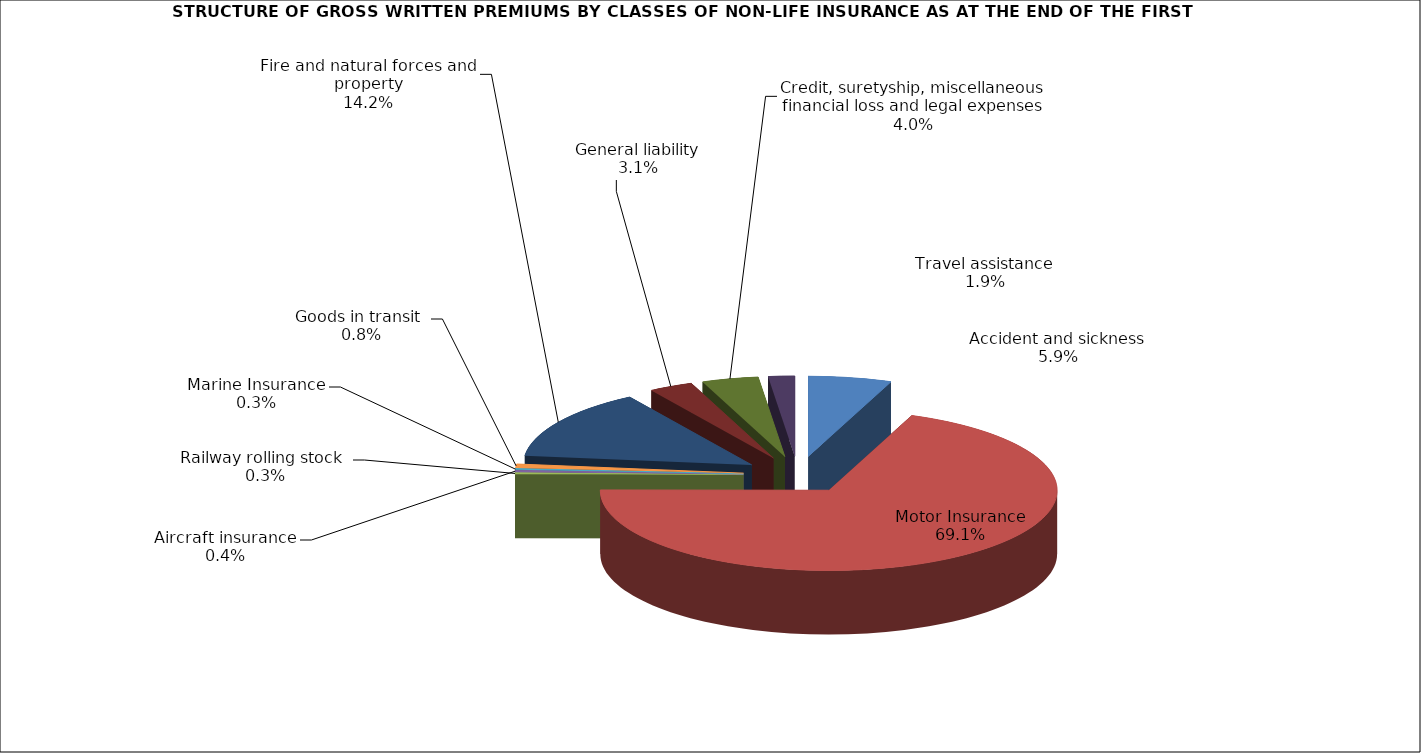
| Category | Accident and sickness |
|---|---|
| Accident and sickness | 0.059 |
| Motor Insurance | 0.691 |
| Railway rolling stock  | 0.003 |
| Aircraft insurance | 0.004 |
| Marine Insurance | 0.003 |
| Goods in transit  | 0.008 |
| Fire and natural forces and property | 0.142 |
| General liability | 0.031 |
| Credit, suretyship, miscellaneous financial loss and legal expenses | 0.04 |
| Travel assistance | 0.019 |